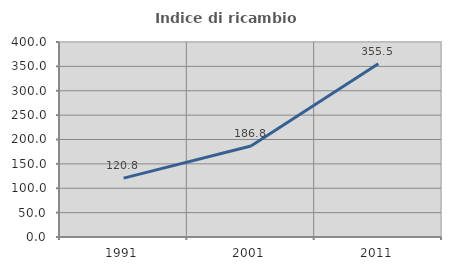
| Category | Indice di ricambio occupazionale  |
|---|---|
| 1991.0 | 120.84 |
| 2001.0 | 186.766 |
| 2011.0 | 355.547 |